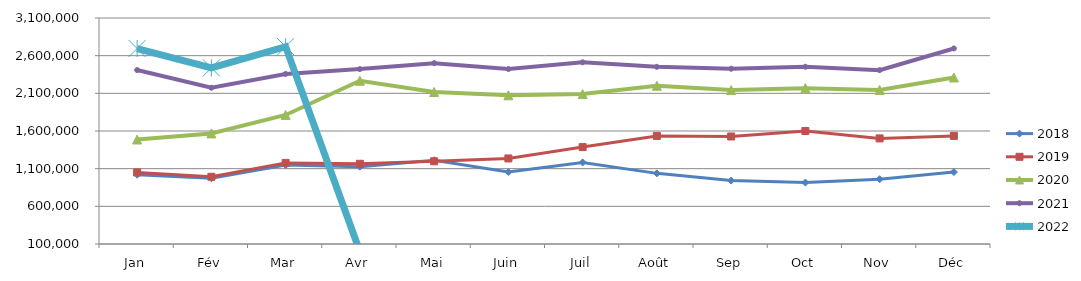
| Category | 2018 | 2019 | 2020 | 2021 | 2022 |
|---|---|---|---|---|---|
| Jan | 1019658.015 | 1050220.805 | 1487095.506 | 2408854.792 | 2694731.985 |
| Fév | 972274.256 | 992184.961 | 1568141.915 | 2173768.196 | 2437594.963 |
| Mar | 1147166.528 | 1176757.88 | 1813146.21 | 2357168.574 | 2719654.074 |
| Avr | 1126714.531 | 1164825.987 | 2267448.511 | 2422161.719 | 0 |
| Mai | 1212070.878 | 1197851.486 | 2117791.111 | 2500803.422 | 0 |
| Juin | 1056092.947 | 1235809.908 | 2073858.17 | 2421915.839 | 0 |
| Juil | 1183060.966 | 1386180.582 | 2090325.728 | 2512181.372 | 0 |
| Août | 1037606.311 | 1534426.4 | 2199836.197 | 2451614.864 | 0 |
| Sep | 941820.554 | 1527323.009 | 2142727.977 | 2426567.826 | 0 |
| Oct | 915772.772 | 1599889.902 | 2168338.194 | 2452518.375 | 0 |
| Nov | 960817.552 | 1501599.407 | 2145083.497 | 2407792.57 | 0 |
| Déc | 1054685.303 | 1534756.751 | 2310730.947 | 2695648.711 | 0 |